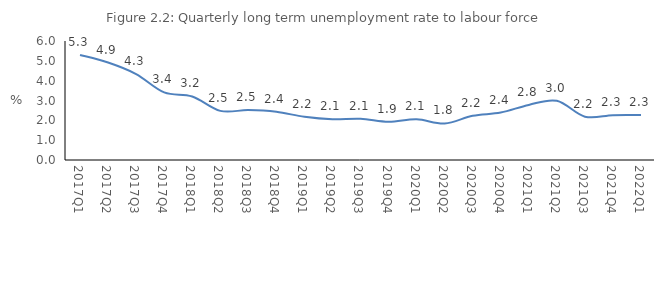
| Category | 2017Q1 |
|---|---|
| 2017Q1 | 5.299 |
| 2017Q2 | 4.913 |
| 2017Q3 | 4.333 |
| 2017Q4 | 3.409 |
| 2018Q1 | 3.202 |
| 2018Q2 | 2.477 |
| 2018Q3 | 2.517 |
| 2018Q4 | 2.43 |
| 2019Q1 | 2.177 |
| 2019Q2 | 2.052 |
| 2019Q3 | 2.078 |
| 2019Q4 | 1.927 |
| 2020Q1 | 2.052 |
| 2020Q2 | 1.842 |
| 2020Q3 | 2.229 |
| 2020Q4 | 2.392 |
| 2021Q1 | 2.778 |
| 2021Q2 | 2.985 |
| 2021Q3 | 2.185 |
| 2021Q4 | 2.259 |
| 2022Q1 | 2.263 |